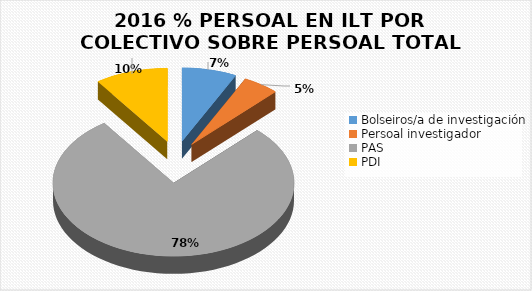
| Category | Series 0 |
|---|---|
| Bolseiros/a de investigación | 0.03 |
| Persoal investigador | 0.02 |
| PAS | 0.32 |
| PDI | 0.04 |